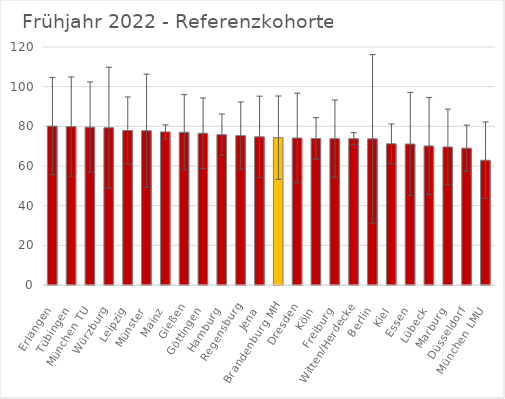
| Category | Mittelwert Ref |
|---|---|
| Erlangen | 80.1 |
| Tübingen | 79.9 |
| München TU | 79.6 |
| Würzburg | 79.3 |
| Leipzig | 77.9 |
| Münster | 77.8 |
| Mainz | 77.2 |
| Gießen | 77 |
| Göttingen | 76.5 |
| Hamburg | 75.8 |
| Regensburg | 75.3 |
| Jena | 74.7 |
| Brandenburg MH | 74.3 |
| Dresden | 74.1 |
| Köln | 73.9 |
| Freiburg | 73.8 |
| Witten/Herdecke | 73.8 |
| Berlin | 73.7 |
| Kiel | 71.2 |
| Essen | 71.1 |
| Lübeck | 70.1 |
| Marburg | 69.6 |
| Düsseldorf | 69 |
| München LMU | 62.9 |